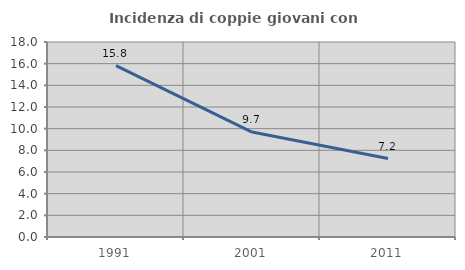
| Category | Incidenza di coppie giovani con figli |
|---|---|
| 1991.0 | 15.824 |
| 2001.0 | 9.69 |
| 2011.0 | 7.243 |